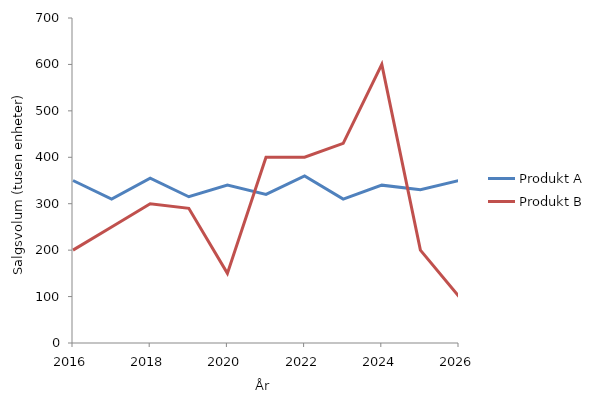
| Category | Produkt A | Produkt B |
|---|---|---|
| 2016.0 | 350 | 200 |
| 2017.0 | 310 | 250 |
| 2018.0 | 355 | 300 |
| 2019.0 | 315 | 290 |
| 2020.0 | 340 | 150 |
| 2021.0 | 320 | 400 |
| 2022.0 | 360 | 400 |
| 2023.0 | 310 | 430 |
| 2024.0 | 340 | 600 |
| 2025.0 | 330 | 200 |
| 2026.0 | 350 | 100 |